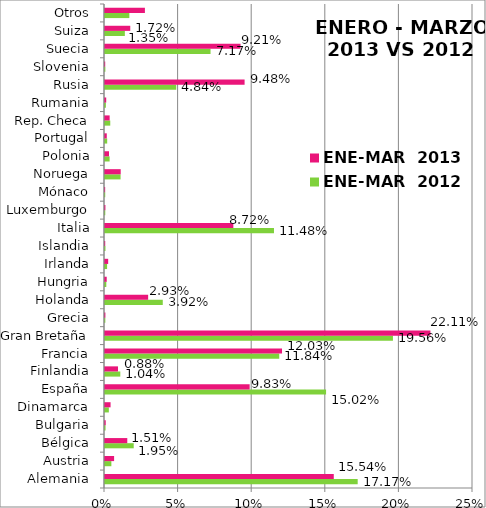
| Category | ENE-MAR  2012 | ENE-MAR  2013 |
|---|---|---|
| Alemania | 0.172 | 0.155 |
| Austria | 0.004 | 0.006 |
| Bélgica | 0.02 | 0.015 |
| Bulgaria | 0 | 0 |
| Dinamarca | 0.003 | 0.004 |
| España | 0.15 | 0.098 |
| Finlandia | 0.01 | 0.009 |
| Francia | 0.118 | 0.12 |
| Gran Bretaña | 0.196 | 0.221 |
| Grecia | 0 | 0 |
| Holanda | 0.039 | 0.029 |
| Hungria | 0.001 | 0.001 |
| Irlanda | 0.001 | 0.002 |
| Islandia | 0 | 0 |
| Italia | 0.115 | 0.087 |
| Luxemburgo | 0 | 0 |
| Mónaco | 0 | 0 |
| Noruega | 0.011 | 0.011 |
| Polonia | 0.003 | 0.003 |
| Portugal | 0.001 | 0.001 |
| Rep. Checa | 0.004 | 0.003 |
| Rumania | 0.001 | 0.001 |
| Rusia | 0.048 | 0.095 |
| Slovenia | 0 | 0 |
| Suecia | 0.072 | 0.092 |
| Suiza | 0.013 | 0.017 |
| Otros | 0.017 | 0.027 |